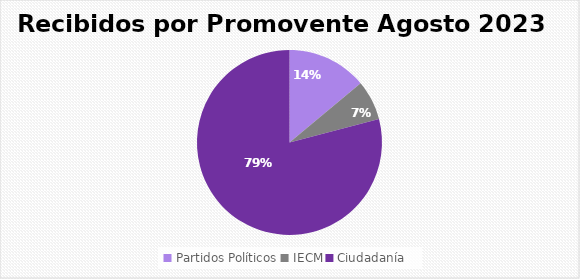
| Category | Recibidos por Promovente AGOSTO |
|---|---|
| Partidos Políticos | 6 |
| IECM | 3 |
| Ciudadanía  | 34 |